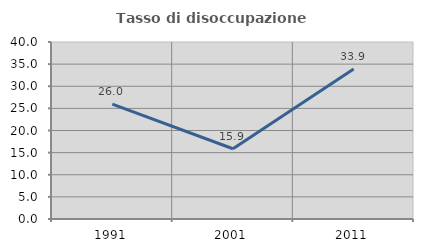
| Category | Tasso di disoccupazione giovanile  |
|---|---|
| 1991.0 | 25.974 |
| 2001.0 | 15.873 |
| 2011.0 | 33.871 |